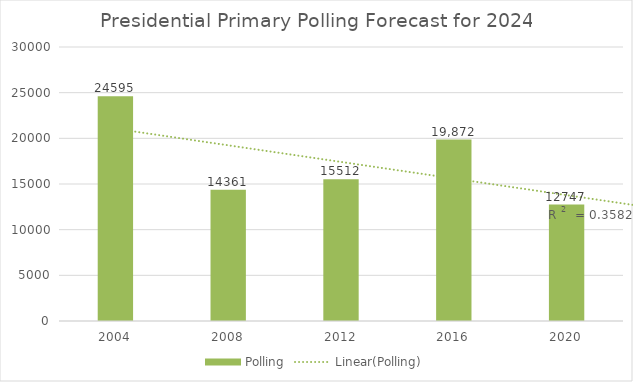
| Category | Polling |
|---|---|
| 2004.0 | 24595 |
| 2008.0 | 14361 |
| 2012.0 | 15512 |
| 2016.0 | 19872 |
| 2020.0 | 12747 |